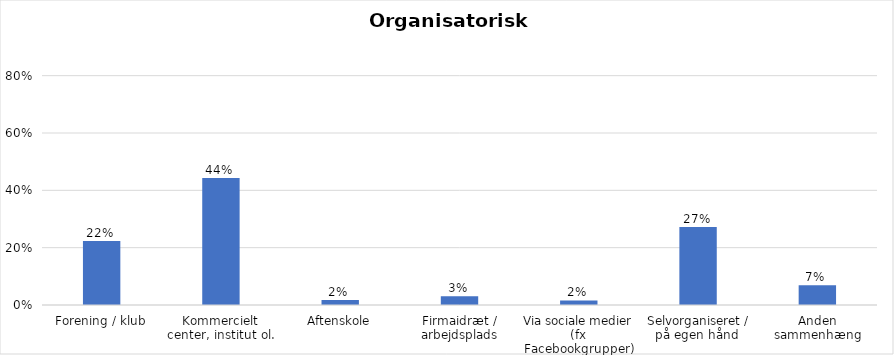
| Category | % |
|---|---|
| Forening / klub | 0.223 |
| Kommercielt center, institut ol. | 0.443 |
| Aftenskole | 0.017 |
| Firmaidræt / arbejdsplads | 0.03 |
| Via sociale medier (fx Facebookgrupper) | 0.016 |
| Selvorganiseret / på egen hånd  | 0.272 |
| Anden sammenhæng | 0.069 |